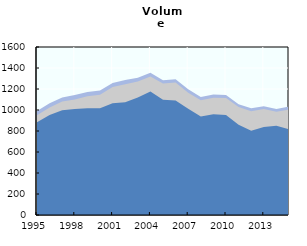
| Category | Inland fisheries | Aquaculture | Marine landings |
|---|---|---|---|
| 1995.0 | 989.342 | 950.239 | 883.97 |
| 1996.0 | 1063.462 | 1024.907 | 951.72 |
| 1997.0 | 1119.629 | 1080.569 | 998.082 |
| 1998.0 | 1142.004 | 1100.998 | 1008.893 |
| 1999.0 | 1171.341 | 1130.485 | 1016.281 |
| 2000.0 | 1185.388 | 1144.453 | 1016.423 |
| 2001.0 | 1256.686 | 1218.645 | 1064.576 |
| 2002.0 | 1286.031 | 1245.787 | 1073.988 |
| 2003.0 | 1307.644 | 1271 | 1120.06 |
| 2004.0 | 1354.494 | 1318.631 | 1176.229 |
| 2005.0 | 1283.855 | 1252.039 | 1096.645 |
| 2006.0 | 1294.002 | 1262.844 | 1090.407 |
| 2007.0 | 1197.317 | 1165.213 | 1012.153 |
| 2008.0 | 1123.924 | 1093.432 | 937.112 |
| 2009.0 | 1146.463 | 1116.769 | 960.232 |
| 2010.0 | 1141.934 | 1114.549 | 951.529 |
| 2011.0 | 1054.146 | 1028.402 | 858.343 |
| 2012.0 | 1016.68 | 987.354 | 803.442 |
| 2013.0 | 1036.86 | 1008.469 | 838.482 |
| 2014.0 | 1010.351 | 983.181 | 849.598 |
| 2015.0 | 1032.976 | 1005.011 | 817.637 |